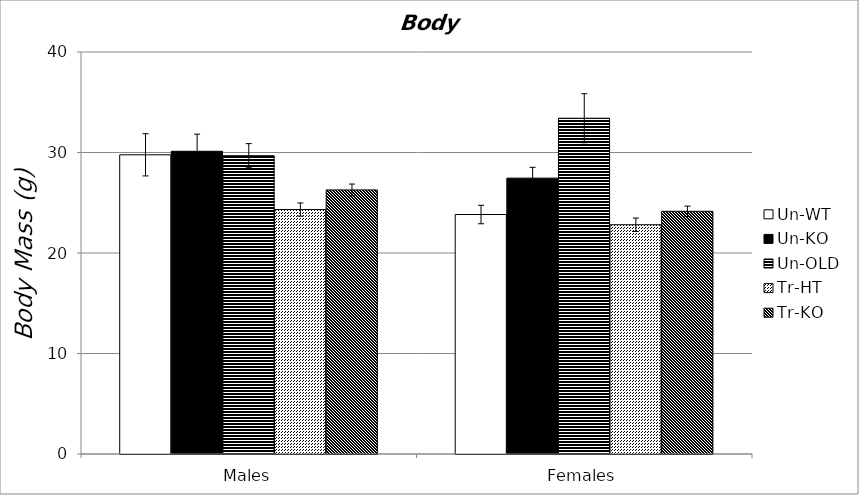
| Category | Un-WT | Un-KO | Un-OLD | Tr-HT | Tr-KO |
|---|---|---|---|---|---|
| 0 | 29.77 | 30.12 | 29.683 | 24.325 | 26.275 |
| 1 | 23.83 | 27.45 | 33.41 | 22.81 | 24.15 |